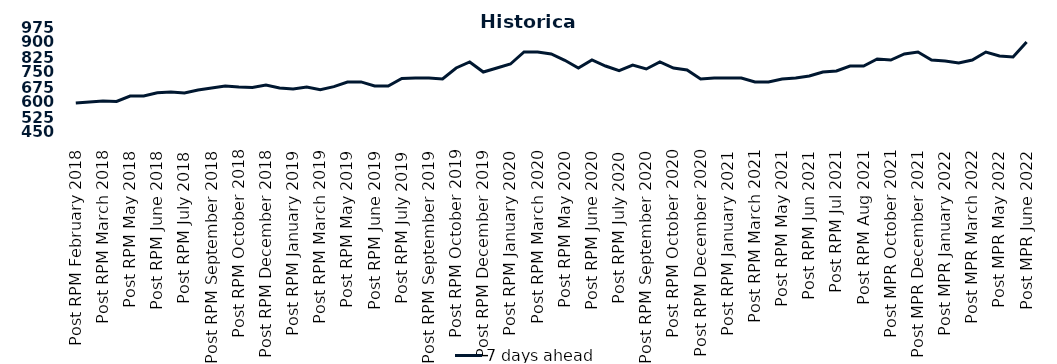
| Category | 7 days ahead |
|---|---|
| Post RPM February 2018 | 595 |
| Pre RPM March 2018 | 600 |
| Post RPM March 2018 | 605 |
| Pre RPM May 2018 | 603 |
| Post RPM May 2018 | 630 |
| Pre RPM June 2018 | 630 |
| Post RPM June 2018 | 646.5 |
| Pre RPM July 2018 | 650 |
| Post RPM July 2018 | 645 |
| Pre RPM September 2018 | 660 |
| Post RPM September 2018 | 670 |
| Pre RPM October 2018 | 680 |
| Post RPM October 2018 | 675 |
| Pre RPM December 2018 | 672.5 |
| Post RPM December 2018 | 685 |
| Pre RPM January 2019 | 670 |
| Post RPM January 2019 | 665 |
| Pre RPM March 2019 | 675 |
| Post RPM March 2019 | 661 |
| Pre RPM May 2019 | 677 |
| Post RPM May 2019 | 700 |
| Pre RPM June 2019 | 700.5 |
| Post RPM June 2019 | 680 |
| Pre RPM July 2019 | 680 |
| Post RPM July 2019 | 717.5 |
| Pre RPM September 2019 | 720 |
| Post RPM September 2019 | 720 |
| Pre RPM October 2019 | 715 |
| Post RPM October 2019 | 770 |
| Pre RPM December 2019 | 800 |
| Post RPM December 2019 | 750 |
| Pre RPM January 2020 | 770 |
| Post RPM January 2020 | 790 |
| Pre RPM March 2020 | 850 |
| Post RPM March 2020 | 850 |
| Pre RPM May 2020 | 840 |
| Post RPM May 2020 | 808.5 |
| Pre RPM June 2020 | 770 |
| Post RPM June 2020 | 810 |
| Pre RPM July 2020 | 780 |
| Post RPM July 2020 | 757 |
| Pre RPM September 2020 | 785 |
| Post RPM September 2020 | 765 |
| Pre RPM October 2020 | 800 |
| Post RPM October 2020 | 770 |
| Pre RPM December 2020 | 760 |
|  Post RPM December 2020 | 715 |
| Pre RPM January 2021 | 720 |
| Post RPM January 2021 | 720 |
|  Pre RPM March 2021 | 720 |
|  Post RPM March 2021 | 700 |
|  Pre RPM May 2021 | 700 |
|  Post RPM May 2021 | 715 |
|  Pre RPM Jun 2021 | 720 |
|   Post RPM Jun 2021 | 730 |
| Pre RPM Jul 2021 | 750 |
|  Post RPM Jul 2021 | 755 |
| Pre RPM Aug 2021 | 780 |
|  Post RPM Aug 2021 | 780 |
| Pre MPR October 2021 | 815 |
| Post MPR October 2021 | 810 |
| Pre MPR December 2021 | 840 |
| Post MPR December 2021 | 850 |
| Pre MPR January 2022 | 810 |
| Post MPR January 2022 | 805 |
| Pre MPR March 2022 | 795 |
| Post MPR March 2022 | 810 |
| Pre MPR May 2022 | 850 |
| Post MPR May 2022 | 830 |
| Pre MPR June 2022 | 825 |
| Post MPR June 2022 | 900 |